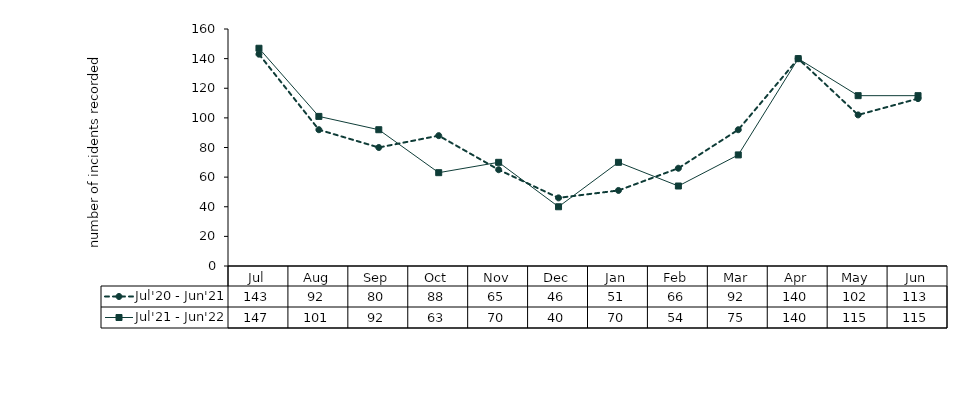
| Category | Jul'20 - Jun'21 | Jul'21 - Jun'22 |
|---|---|---|
| Jul | 143 | 147 |
| Aug | 92 | 101 |
| Sep | 80 | 92 |
| Oct | 88 | 63 |
| Nov | 65 | 70 |
| Dec | 46 | 40 |
| Jan | 51 | 70 |
| Feb | 66 | 54 |
| Mar | 92 | 75 |
| Apr | 140 | 140 |
| May | 102 | 115 |
| Jun | 113 | 115 |